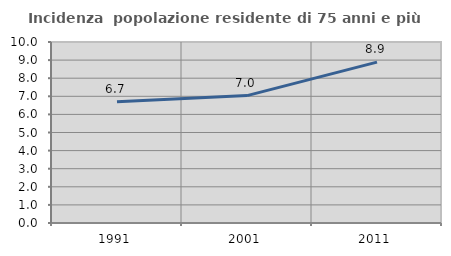
| Category | Incidenza  popolazione residente di 75 anni e più |
|---|---|
| 1991.0 | 6.701 |
| 2001.0 | 7.038 |
| 2011.0 | 8.89 |